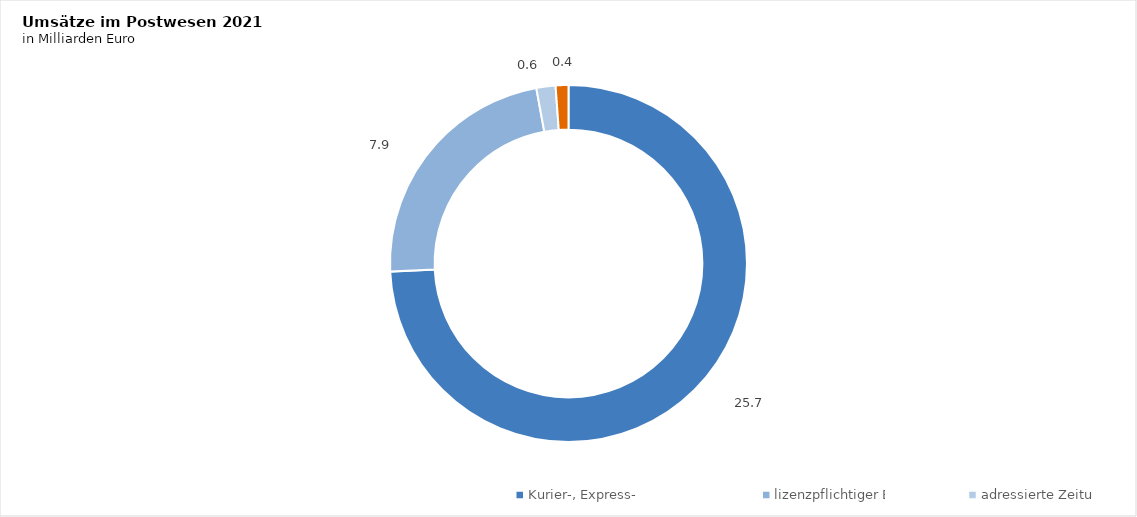
| Category | Series 0 |
|---|---|
| Kurier-, Express- und Paketdienste | 25.7 |
| lizenzpflichtiger Briefbereich | 7.9 |
| adressierte Zeitungen und Zeitschriften | 0.6 |
| nicht lizenzpfl. Sendungen über das Briefnetz | 0.4 |